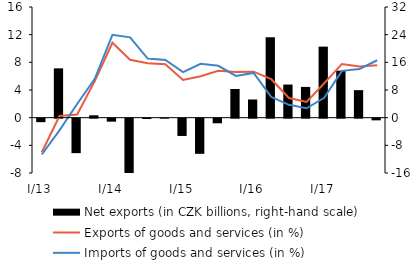
| Category | Net exports (in CZK billions, right-hand scale) |
|---|---|
| I/13 | -1.008 |
| II | 14.257 |
| III | -9.97 |
| IV | 0.683 |
| I/14 | -0.863 |
| II | -15.705 |
| III | -0.101 |
| IV | 0.001 |
| I/15 | -4.999 |
| II | -10.17 |
| III | -1.337 |
| IV | 8.296 |
| I/16 | 5.256 |
| II | 23.246 |
| III | 9.579 |
| IV | 8.895 |
| I/17 | 20.541 |
| II | 13.603 |
| III | 7.958 |
| IV | -0.485 |